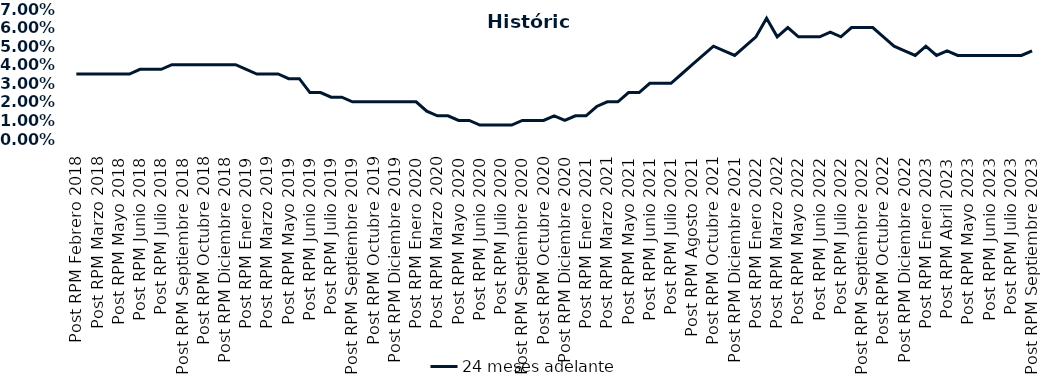
| Category | 24 meses adelante  |
|---|---|
| Post RPM Febrero 2018 | 0.035 |
| Pre RPM Marzo 2018 | 0.035 |
| Post RPM Marzo 2018 | 0.035 |
| Pre RPM Mayo 2018 | 0.035 |
| Post RPM Mayo 2018 | 0.035 |
| Pre RPM Junio 2018 | 0.035 |
| Post RPM Junio 2018 | 0.038 |
| Pre RPM Julio 2018 | 0.038 |
| Post RPM Julio 2018 | 0.038 |
| Pre RPM Septiembre 2018 | 0.04 |
| Post RPM Septiembre 2018 | 0.04 |
| Pre RPM Octubre 2018 | 0.04 |
| Post RPM Octubre 2018 | 0.04 |
| Pre RPM Diciembre 2018 | 0.04 |
| Post RPM Diciembre 2018 | 0.04 |
| Pre RPM Enero 2019 | 0.04 |
| Post RPM Enero 2019 | 0.038 |
| Pre RPM Marzo 2019 | 0.035 |
| Post RPM Marzo 2019 | 0.035 |
| Pre RPM Mayo 2019 | 0.035 |
| Post RPM Mayo 2019 | 0.032 |
| Pre RPM Junio 2019 | 0.032 |
| Post RPM Junio 2019 | 0.025 |
| Pre RPM Julio 2019 | 0.025 |
| Post RPM Julio 2019 | 0.022 |
| Pre RPM Septiembre 2019 | 0.022 |
| Post RPM Septiembre 2019 | 0.02 |
| Pre RPM Octubre 2019 | 0.02 |
| Post RPM Octubre 2019 | 0.02 |
| Pre RPM Diciembre 2019 | 0.02 |
| Post RPM Diciembre 2019 | 0.02 |
| Pre RPM Enero 2020 | 0.02 |
| Post RPM Enero 2020 | 0.02 |
| Pre RPM Marzo 2020 | 0.015 |
| Post RPM Marzo 2020 | 0.012 |
| Pre RPM Mayo 2020 | 0.012 |
| Post RPM Mayo 2020 | 0.01 |
| Pre RPM Junio 2020 | 0.01 |
| Post RPM Junio 2020 | 0.008 |
| Pre RPM Julio 2020 | 0.008 |
| Post RPM Julio 2020 | 0.008 |
| Pre RPM Septiembre 2020 | 0.008 |
| Post RPM Septiembre 2020 | 0.01 |
| Pre RPM Octubre 2020 | 0.01 |
| Post RPM Octubre 2020 | 0.01 |
| Pre RPM Diciembre 2020 | 0.012 |
| Post RPM Diciembre 2020 | 0.01 |
| Pre RPM Enero 2021 | 0.012 |
| Post RPM Enero 2021 | 0.012 |
| Pre RPM Marzo 2021 | 0.018 |
| Post RPM Marzo 2021 | 0.02 |
| Pre RPM Mayo 2021 | 0.02 |
| Post RPM Mayo 2021 | 0.025 |
| Pre RPM Junio 2021 | 0.025 |
| Post RPM Junio 2021 | 0.03 |
| Pre RPM Julio 2021 | 0.03 |
| Post RPM Julio 2021 | 0.03 |
| Pre RPM Agosto 2021 | 0.035 |
| Post RPM Agosto 2021 | 0.04 |
| Pre RPM Octubre 2021 | 0.045 |
| Post RPM Octubre 2021 | 0.05 |
| Pre RPM Diciembre 2021 | 0.048 |
| Post RPM Diciembre 2021 | 0.045 |
| Pre RPM Enero 2022 | 0.05 |
| Post RPM Enero 2022 | 0.055 |
| Pre RPM Marzo 2022 | 0.065 |
| Post RPM Marzo 2022 | 0.055 |
| Pre RPM Mayo 2022 | 0.06 |
| Post RPM Mayo 2022 | 0.055 |
| Pre RPM Junio 2022 | 0.055 |
| Post RPM Junio 2022 | 0.055 |
| Pre RPM Julio 2022 | 0.058 |
| Post RPM Julio 2022 | 0.055 |
| Pre RPM Septiembre 2022 | 0.06 |
| Post RPM Septiembre 2022 | 0.06 |
| Pre RPM Octubre 2022 | 0.06 |
| Post RPM Octubre 2022 | 0.055 |
| Pre RPM Diciembre 2022 | 0.05 |
| Post RPM Diciembre 2022 | 0.048 |
| Pre RPM Enero 2023 | 0.045 |
| Post RPM Enero 2023 | 0.05 |
| Pre RPM Abril 2023 | 0.045 |
| Post RPM Abril 2023 | 0.048 |
| Pre RPM Mayo 2023 | 0.045 |
| Post RPM Mayo 2023 | 0.045 |
| Pre RPM Junio 2023 | 0.045 |
| Post RPM Junio 2023 | 0.045 |
| Pre RPM Julio 2023 | 0.045 |
| Post RPM Julio 2023 | 0.045 |
| Pre RPM Septiembre 2023 | 0.045 |
| Post RPM Septiembre 2023 | 0.048 |